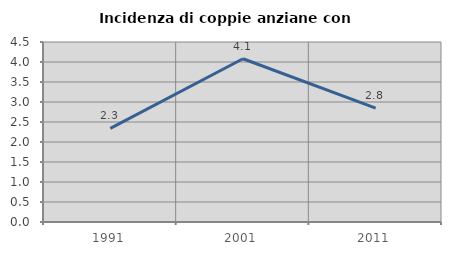
| Category | Incidenza di coppie anziane con figli |
|---|---|
| 1991.0 | 2.341 |
| 2001.0 | 4.082 |
| 2011.0 | 2.845 |